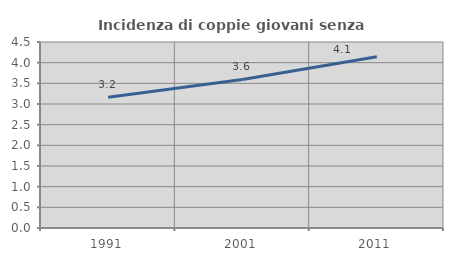
| Category | Incidenza di coppie giovani senza figli |
|---|---|
| 1991.0 | 3.165 |
| 2001.0 | 3.593 |
| 2011.0 | 4.142 |